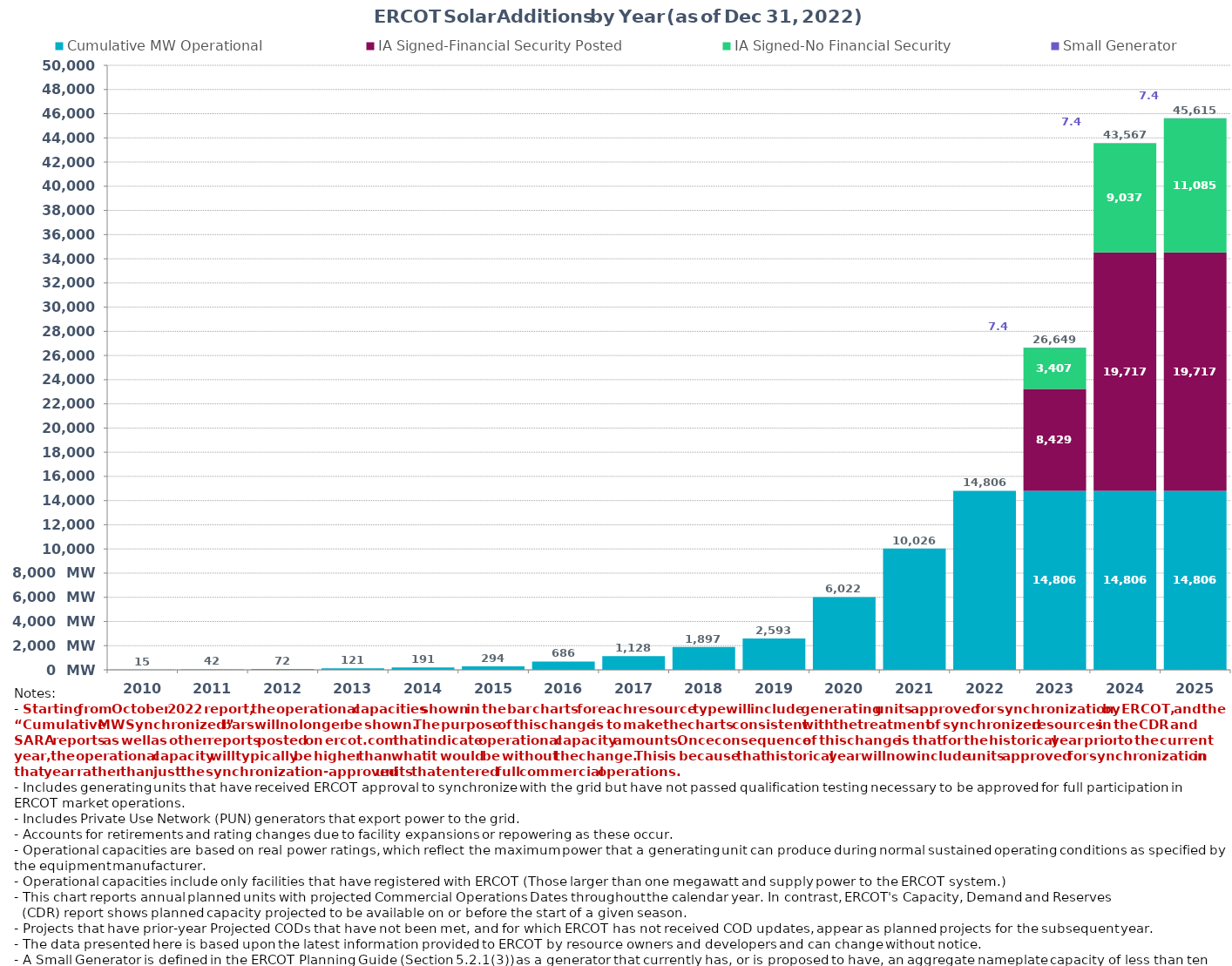
| Category | Cumulative MW Operational  | IA Signed-Financial Security Posted  | IA Signed-No Financial Security  | Small Generator | Cumulative Installed and Planned |
|---|---|---|---|---|---|
| 2010.0 | 14.9 | 0 | 0 | 0 | 14.9 |
| 2011.0 | 41.6 | 0 | 0 | 0 | 41.6 |
| 2012.0 | 72 | 0 | 0 | 0 | 72 |
| 2013.0 | 121.18 | 0 | 0 | 0 | 121.18 |
| 2014.0 | 190.7 | 0 | 0 | 0 | 190.7 |
| 2015.0 | 294.3 | 0 | 0 | 0 | 294.3 |
| 2016.0 | 685.6 | 0 | 0 | 0 | 685.6 |
| 2017.0 | 1127.5 | 0 | 0 | 0 | 1127.5 |
| 2018.0 | 1896.54 | 0 | 0 | 0 | 1896.54 |
| 2019.0 | 2592.73 | 0 | 0 | 0 | 2592.73 |
| 2020.0 | 6022.02 | 0 | 0 | 0 | 6022.02 |
| 2021.0 | 10025.5 | 0 | 0 | 0 | 10025.5 |
| 2022.0 | 14805.6 | 0 | 0 | 0 | 14805.6 |
| 2023.0 | 14805.6 | 8428.96 | 3407.03 | 7.41 | 26649 |
| 2024.0 | 14805.6 | 19717.41 | 9036.92 | 7.41 | 43567.34 |
| 2025.0 | 14805.6 | 19717.41 | 11084.51 | 7.41 | 45614.93 |